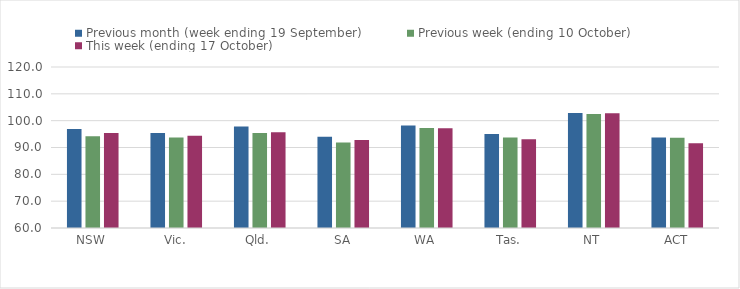
| Category | Previous month (week ending 19 September) | Previous week (ending 10 October) | This week (ending 17 October) |
|---|---|---|---|
| NSW | 96.92 | 94.16 | 95.4 |
| Vic. | 95.41 | 93.69 | 94.42 |
| Qld. | 97.86 | 95.45 | 95.7 |
| SA | 94.01 | 91.89 | 92.81 |
| WA | 98.21 | 97.28 | 97.22 |
| Tas. | 95 | 93.75 | 93.07 |
| NT | 102.87 | 102.44 | 102.73 |
| ACT | 93.75 | 93.66 | 91.57 |